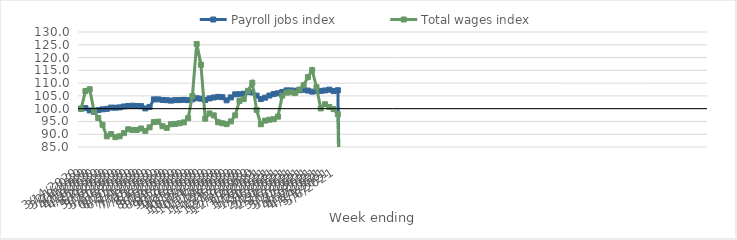
| Category | Payroll jobs index | Total wages index |
|---|---|---|
| 14/03/2020 | 100 | 100 |
| 21/03/2020 | 100.218 | 106.894 |
| 28/03/2020 | 99.312 | 107.602 |
| 04/04/2020 | 98.775 | 99.153 |
| 11/04/2020 | 99.411 | 96.344 |
| 18/04/2020 | 99.752 | 93.672 |
| 25/04/2020 | 99.92 | 89.179 |
| 02/05/2020 | 100.415 | 90.062 |
| 09/05/2020 | 100.374 | 88.851 |
| 16/05/2020 | 100.499 | 89.206 |
| 23/05/2020 | 100.864 | 90.427 |
| 30/05/2020 | 101.039 | 91.942 |
| 06/06/2020 | 101.161 | 91.668 |
| 13/06/2020 | 101.065 | 91.665 |
| 20/06/2020 | 100.997 | 92.237 |
| 27/06/2020 | 100.106 | 91.308 |
| 04/07/2020 | 100.668 | 92.689 |
| 11/07/2020 | 103.636 | 94.754 |
| 18/07/2020 | 103.635 | 94.921 |
| 25/07/2020 | 103.41 | 93.138 |
| 01/08/2020 | 103.316 | 92.475 |
| 08/08/2020 | 103.156 | 93.904 |
| 15/08/2020 | 103.335 | 94.032 |
| 22/08/2020 | 103.365 | 94.284 |
| 29/08/2020 | 103.448 | 94.647 |
| 05/09/2020 | 103.333 | 96.266 |
| 12/09/2020 | 103.664 | 104.942 |
| 19/09/2020 | 104.077 | 125.302 |
| 26/09/2020 | 103.904 | 117.192 |
| 03/10/2020 | 103.389 | 96.108 |
| 10/10/2020 | 104.023 | 98.134 |
| 17/10/2020 | 104.376 | 97.383 |
| 24/10/2020 | 104.631 | 94.681 |
| 31/10/2020 | 104.503 | 94.293 |
| 07/11/2020 | 103.264 | 93.935 |
| 14/11/2020 | 104.41 | 95.007 |
| 21/11/2020 | 105.604 | 97.383 |
| 28/11/2020 | 105.652 | 103.042 |
| 05/12/2020 | 105.861 | 103.752 |
| 12/12/2020 | 106.502 | 106.98 |
| 19/12/2020 | 106.329 | 110.109 |
| 26/12/2020 | 105.112 | 99.51 |
| 02/01/2021 | 103.761 | 93.898 |
| 09/01/2021 | 104.304 | 95.318 |
| 16/01/2021 | 105.135 | 95.682 |
| 23/01/2021 | 105.73 | 95.874 |
| 30/01/2021 | 106.012 | 96.878 |
| 06/02/2021 | 106.543 | 105.09 |
| 13/02/2021 | 107.162 | 106.282 |
| 20/02/2021 | 107.139 | 106.41 |
| 27/02/2021 | 107.018 | 106.082 |
| 06/03/2021 | 107.212 | 107.478 |
| 13/03/2021 | 107.367 | 109.166 |
| 20/03/2021 | 107.08 | 112.335 |
| 27/03/2021 | 106.653 | 115.106 |
| 03/04/2021 | 106.878 | 108.402 |
| 10/04/2021 | 106.949 | 100.094 |
| 17/04/2021 | 107.132 | 101.723 |
| 24/04/2021 | 107.442 | 100.657 |
| 01/05/2021 | 106.867 | 99.831 |
| 08/05/2021 | 107.208 | 97.835 |